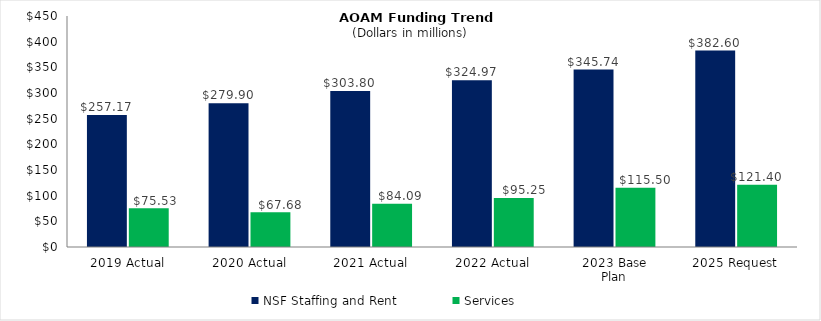
| Category | NSF Staffing and Rent | Services |
|---|---|---|
| 2019 Actual | 257.17 | 75.533 |
| 2020 Actual | 279.901 | 67.682 |
| 2021 Actual | 303.803 | 84.088 |
| 2022 Actual | 324.966 | 95.247 |
| 2023 Base
Plan | 345.742 | 115.502 |
| 2025 Request | 382.6 | 121.4 |